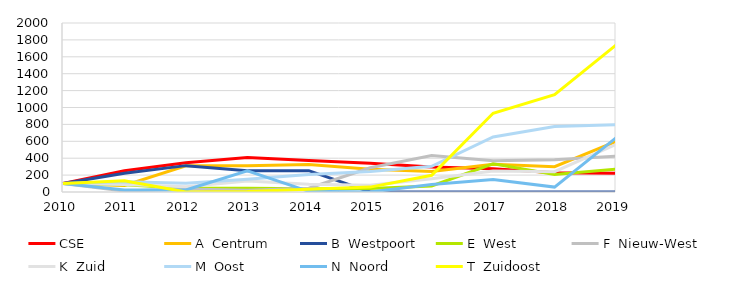
| Category | CSE | A  Centrum | B  Westpoort | E  West  | F  Nieuw-West | K  Zuid  | M  Oost | N  Noord | T  Zuidoost |
|---|---|---|---|---|---|---|---|---|---|
| 2010.0 | 100 | 100 | 100 | 100 | 100 | 100 | 100 | 100 | 100 |
| 2011.0 | 251 | 77 | 221 | 86 | 11 | 88 | 121 | 23 | 132 |
| 2012.0 | 345 | 311 | 312 | 43 | 36 | 62 | 103 | 25 | 0 |
| 2013.0 | 409 | 311 | 252 | 45 | 20 | 131 | 150 | 252 | 5 |
| 2014.0 | 372.703 | 325.512 | 252.4 | 37.239 | 45.436 | 91.535 | 208.302 | 8.228 | 31.579 |
| 2015.0 | 340 | 270 | 0 | 40 | 287 | 80 | 243 | 0 | 58 |
| 2016.0 | 294.548 | 243.051 | 0 | 70.601 | 431.95 | 156.212 | 303.472 | 87.975 | 197.368 |
| 2017.0 | 275.099 | 328.461 | 0 | 333.153 | 370.332 | 249.081 | 651.774 | 147.468 | 931.579 |
| 2018.0 | 226.561 | 299.894 | 0 | 206.797 | 380.913 | 240.529 | 774.868 | 58.228 | 1152.632 |
| 2019.0 | 221.222 | 598.299 | 0 | 270.684 | 424.481 | 563.276 | 796.981 | 640.506 | 1739.474 |